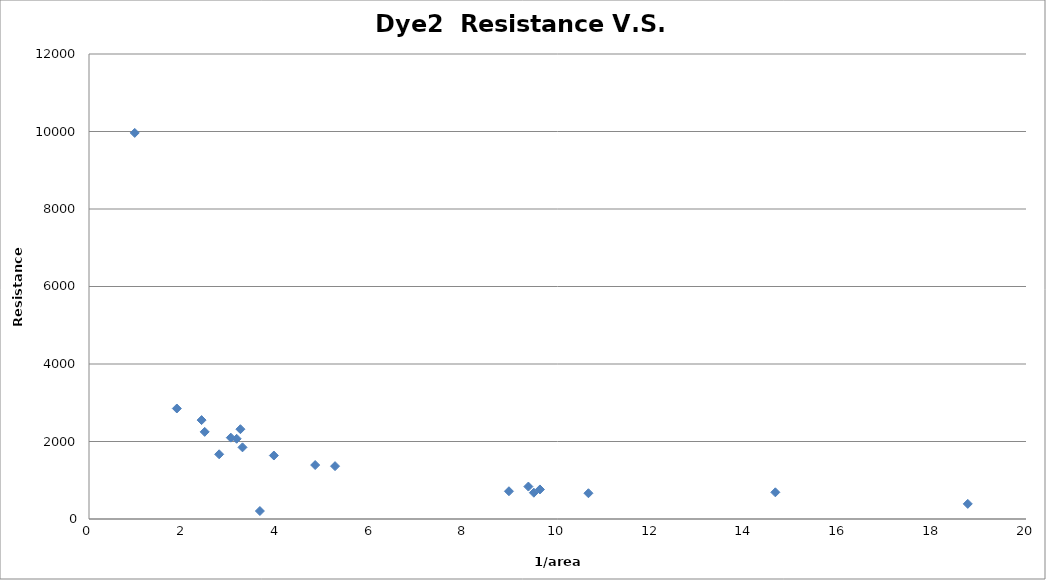
| Category | Series 0 |
|---|---|
| 0.976 | 9963.654 |
| 3.232 | 2317.674 |
| 2.4034 | 2552.368 |
| 1.8748 | 2851.852 |
| 3.152 | 2069.894 |
| 3.2761 | 1849.252 |
| 2.4696 | 2248.666 |
| 3.0272 | 2099.24 |
| 2.7782999999999998 | 1670.043 |
| 3.6476999999999995 | 205.861 |
| 5.252000000000001 | 1363.938 |
| 3.9458 | 1637.984 |
| 4.8278 | 1392.478 |
| 9.3786 | 837.059 |
| 10.660599999999999 | 664.902 |
| 9.625399999999999 | 762.689 |
| 8.9639 | 716.321 |
| 9.495199999999999 | 678.26 |
| 18.7572 | 390.081 |
| 14.649600000000001 | 688.541 |